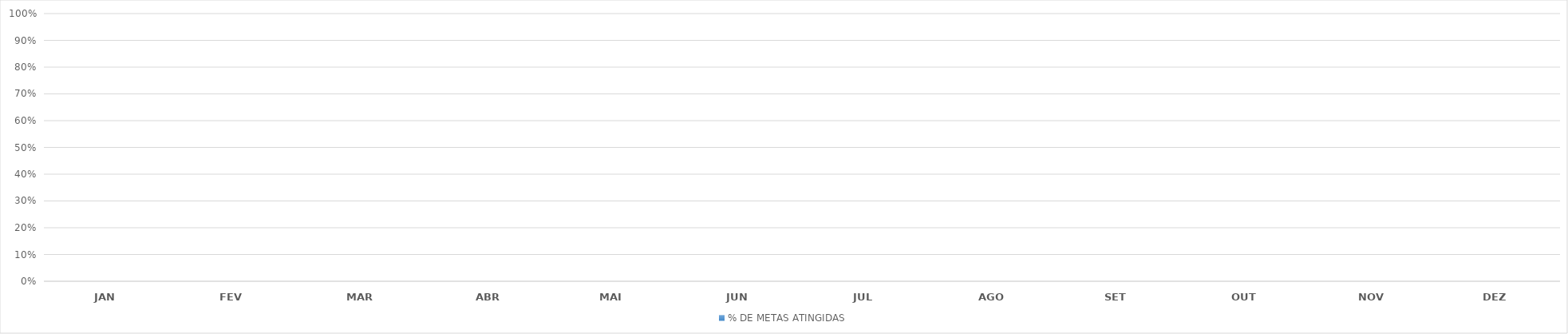
| Category | % DE METAS ATINGIDAS |
|---|---|
| JAN | 0 |
| FEV | 0 |
| MAR | 0 |
| ABR | 0 |
| MAI | 0 |
| JUN | 0 |
| JUL | 0 |
| AGO | 0 |
| SET | 0 |
| OUT | 0 |
| NOV | 0 |
| DEZ | 0 |